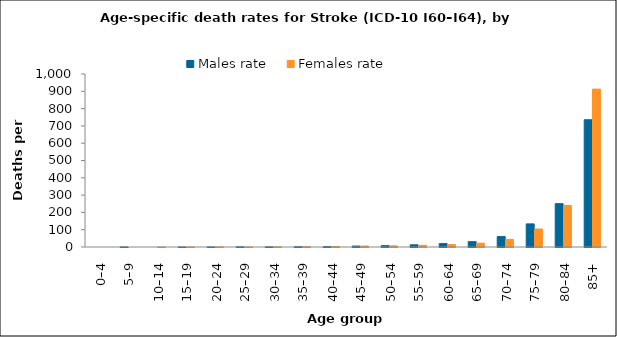
| Category | Males rate | Females rate |
|---|---|---|
| 0–4 | 0 | 0 |
| 5–9 | 0.241 | 0 |
| 10–14 | 0 | 0.127 |
| 15–19 | 0.262 | 0.279 |
| 20–24 | 0.239 | 0.254 |
| 25–29 | 0.871 | 0.221 |
| 30–34 | 0.638 | 0.73 |
| 35–39 | 1.508 | 1.278 |
| 40–44 | 2.206 | 2.623 |
| 45–49 | 5.384 | 5.644 |
| 50–54 | 7.807 | 6.606 |
| 55–59 | 12.59 | 9.645 |
| 60–64 | 19.685 | 13.929 |
| 65–69 | 30.929 | 22.185 |
| 70–74 | 60.214 | 43.913 |
| 75–79 | 133.56 | 104.208 |
| 80–84 | 250.438 | 240.315 |
| 85+ | 735.572 | 912.602 |